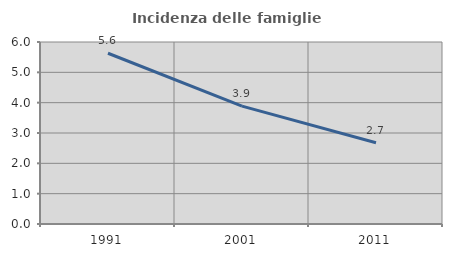
| Category | Incidenza delle famiglie numerose |
|---|---|
| 1991.0 | 5.629 |
| 2001.0 | 3.888 |
| 2011.0 | 2.679 |